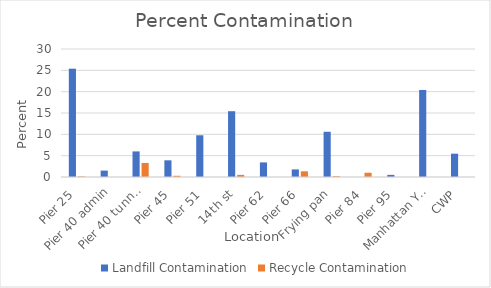
| Category | Landfill Contamination | Recycle Contamination |
|---|---|---|
| Pier 25 | 25.385 | 0.133 |
| Pier 40 admin | 1.5 | 0 |
| Pier 40 tunnel | 6 | 3.29 |
| Pier 45 | 3.909 | 0.286 |
| Pier 51 | 9.778 | 0 |
| 14th st | 15.421 | 0.5 |
| Pier 62 | 3.418 | 0 |
| Pier 66 | 1.778 | 1.333 |
| Frying pan | 10.6 | 0.2 |
| Pier 84 | 0 | 1 |
| Pier 95 | 0.5 | 0 |
| Manhattan Youth | 20.4 | 0 |
| CWP | 5.467 | 0 |